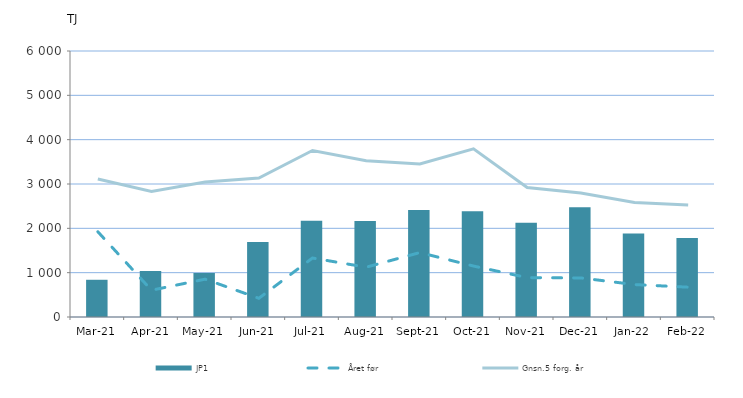
| Category | JP1 |
|---|---|
| 2021-03-01 | 839.724 |
| 2021-04-01 | 1037.249 |
| 2021-05-01 | 992.357 |
| 2021-06-01 | 1690.445 |
| 2021-07-01 | 2172.634 |
| 2021-08-01 | 2166.718 |
| 2021-09-01 | 2411.501 |
| 2021-10-01 | 2382.547 |
| 2021-11-01 | 2123.914 |
| 2021-12-01 | 2474.28 |
| 2022-01-01 | 1884.803 |
| 2022-02-01 | 1780.925 |